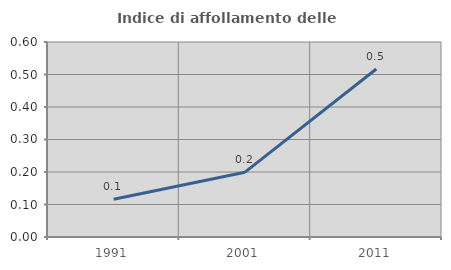
| Category | Indice di affollamento delle abitazioni  |
|---|---|
| 1991.0 | 0.116 |
| 2001.0 | 0.199 |
| 2011.0 | 0.517 |